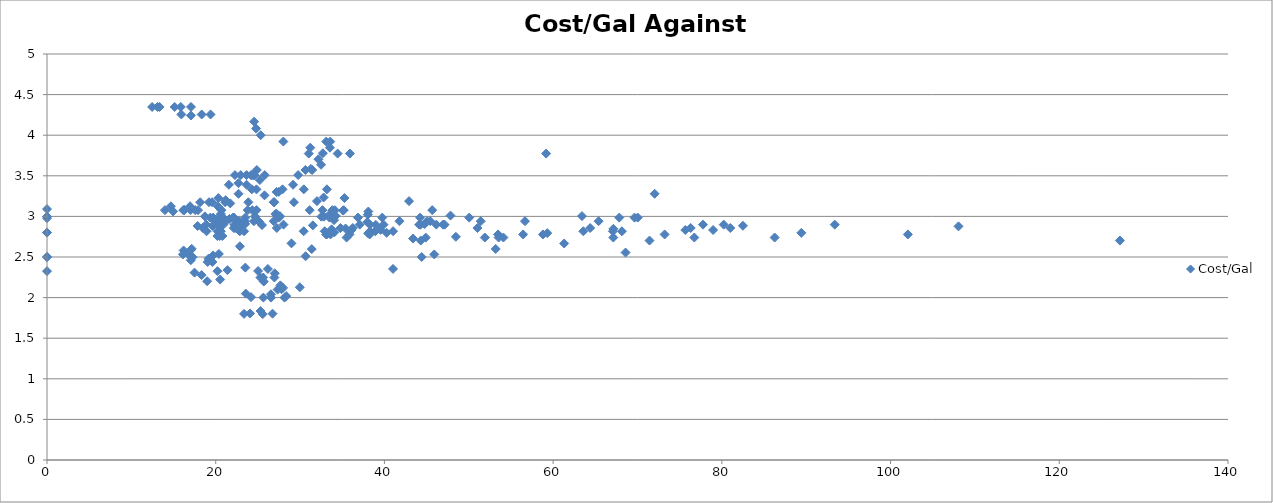
| Category | Cost/Gal |
|---|---|
| 0.0 | 2.5 |
| 0.0 | 2.5 |
| 0.0 | 2.326 |
| 0.0 | 2.801 |
| 0.0 | 2.801 |
| 0.0 | 3.09 |
| 0.0 | 2.978 |
| 0.0 | 2.999 |
| 0.0 | 2.999 |
| 23.458823529411763 | 2.94 |
| 22.870967741935484 | 2.928 |
| 19.62857142857143 | 2.882 |
| 17.854545454545455 | 2.882 |
| 21.638297872340427 | 2.969 |
| 20.333333333333332 | 2.882 |
| 21.164835164835164 | 2.936 |
| 20.78494623655914 | 2.759 |
| 20.462365591397848 | 2.759 |
| 20.376237623762375 | 2.538 |
| 19.150537634408604 | 2.479 |
| 19.608695652173914 | 2.439 |
| 20.20689655172414 | 2.326 |
| 18.98913043478261 | 2.202 |
| 17.489795918367346 | 2.308 |
| 16.11340206185567 | 2.532 |
| 16.96629213483146 | 2.519 |
| 16.70967741935484 | 2.538 |
| 16.197802197802197 | 2.58 |
| 17.151515151515152 | 2.601 |
| 16.989247311827956 | 2.581 |
| 17.043010752688172 | 2.46 |
| 17.263736263736263 | 2.498 |
| 18.32894736842105 | 2.277 |
| 20.525641025641026 | 2.222 |
| 19.048192771084338 | 2.439 |
| 19.691358024691358 | 2.519 |
| 20.2 | 2.759 |
| 19.985915492957748 | 2.941 |
| 20.3 | 2.941 |
| 20.27536231884058 | 2.981 |
| 22.29230769230769 | 2.857 |
| 21.727272727272727 | 3.161 |
| 21.176470588235293 | 3.2 |
| 22.703125 | 3.279 |
| 23.65573770491803 | 3.39 |
| 24.580645161290324 | 3.509 |
| 25.224137931034484 | 3.448 |
| 27.925925925925927 | 3.333 |
| 29.163265306122447 | 3.39 |
| 30.44 | 3.333 |
| 33.18181818181818 | 3.333 |
| 32.79545454545455 | 3.233 |
| 35.26086956521739 | 3.226 |
| 34.12765957446808 | 3.077 |
| 35.075 | 3.072 |
| 32.84 | 2.996 |
| 34.224489795918366 | 3.006 |
| 32.52542372881356 | 2.996 |
| 31.516129032258064 | 2.89 |
| 38.27777777777778 | 2.899 |
| 38.035714285714285 | 3.021 |
| 39.53703703703704 | 2.834 |
| 40.25925925925926 | 2.798 |
| 44.767857142857146 | 2.905 |
| 51.9 | 2.74 |
| 44.892857142857146 | 2.738 |
| 53.46938775510204 | 2.778 |
| 59.3 | 2.794 |
| 59.170731707317074 | 3.774 |
| 63.416666666666664 | 3.004 |
| 72.03225806451613 | 3.279 |
| 89.42307692307692 | 2.797 |
| 82.5 | 2.885 |
| 93.38095238095238 | 2.899 |
| 108.05263157894737 | 2.878 |
| 127.1875 | 2.703 |
| 102.04761904761905 | 2.778 |
| 80.21739130434783 | 2.899 |
| 75.66666666666667 | 2.832 |
| 73.21428571428571 | 2.778 |
| 58.794117647058826 | 2.778 |
| 56.44117647058823 | 2.778 |
| 51.027027027027025 | 2.857 |
| 44.225 | 2.985 |
| 29.274509803921568 | 3.175 |
| 26.875 | 3.175 |
| 26.946428571428573 | 3.175 |
| 23.866666666666667 | 3.175 |
| 20.24590163934426 | 3.125 |
| 19.35593220338983 | 2.985 |
| 17.90909090909091 | 3.077 |
| 17.015384615384615 | 3.077 |
| 16.953846153846154 | 3.125 |
| 19.20689655172414 | 3.175 |
| 20.615384615384617 | 3.03 |
| 21.115384615384617 | 3.175 |
| 22.040816326530614 | 2.985 |
| 20.865384615384617 | 2.985 |
| 20.90566037735849 | 2.899 |
| 23.06382978723404 | 2.899 |
| 23.51063829787234 | 2.985 |
| 25.13953488372093 | 2.936 |
| 24.28301886792453 | 3.333 |
| 22.69811320754717 | 3.409 |
| 22.966666666666665 | 3.509 |
| 23.655172413793103 | 3.509 |
| 24.267857142857142 | 3.509 |
| 24.425925925925927 | 3.509 |
| 25.81132075471698 | 3.509 |
| 24.535714285714285 | 3.509 |
| 24.189655172413794 | 3.509 |
| 24.82608695652174 | 3.333 |
| 29.772727272727273 | 3.509 |
| 31.43243243243243 | 3.571 |
| 30.63888888888889 | 3.571 |
| 31.28125 | 3.585 |
| 35.911764705882355 | 3.774 |
| 31.026315789473685 | 3.774 |
| 34.45454545454545 | 3.774 |
| 25.333333333333332 | 4 |
| 24.5531914893617 | 4.167 |
| 19.38888888888889 | 4.255 |
| 18.339622641509433 | 4.255 |
| 17.06779661016949 | 4.348 |
| 15.859154929577464 | 4.348 |
| 13.338235294117647 | 4.348 |
| 13.109375 | 4.348 |
| 12.462686567164178 | 4.348 |
| 15.134615384615385 | 4.348 |
| 15.923076923076923 | 4.255 |
| 17.0625 | 4.243 |
| 24.78688524590164 | 4.082 |
| 28.016666666666666 | 3.922 |
| 33.1 | 3.922 |
| 31.21153846153846 | 3.846 |
| 33.54 | 3.846 |
| 33.57692307692308 | 3.922 |
| 32.7037037037037 | 3.778 |
| 32.17741935483871 | 3.704 |
| 32.483870967741936 | 3.636 |
| 24.87037037037037 | 3.571 |
| 22.28301886792453 | 3.509 |
| 21.557692307692307 | 3.389 |
| 24.333333333333332 | 3.077 |
| 22.21311475409836 | 2.899 |
| 22.71186440677966 | 2.941 |
| 22.866666666666667 | 2.632 |
| 21.392156862745097 | 2.338 |
| 25.02173913043478 | 2.328 |
| 24.18867924528302 | 2.006 |
| 25.649122807017545 | 2 |
| 25.317460317460316 | 1.835 |
| 23.360655737704917 | 1.8 |
| 24.066666666666666 | 1.805 |
| 25.56896551724138 | 1.797 |
| 26.737704918032787 | 1.802 |
| 26.560606060606062 | 2 |
| 23.571428571428573 | 2.049 |
| 28.36842105263158 | 2.019 |
| 28.155172413793103 | 2 |
| 27.333333333333332 | 2.099 |
| 26.546875 | 2.041 |
| 27.80597014925373 | 2.105 |
| 27.666666666666668 | 2.151 |
| 29.967741935483872 | 2.128 |
| 27.785714285714285 | 2.105 |
| 27.985507246376812 | 2.119 |
| 25.696202531645568 | 2.198 |
| 25.293333333333333 | 2.247 |
| 25.63013698630137 | 2.247 |
| 26.955882352941178 | 2.247 |
| 27.0 | 2.299 |
| 26.184615384615384 | 2.353 |
| 23.514285714285716 | 2.369 |
| 30.653846153846153 | 2.51 |
| 41.02 | 2.353 |
| 44.41860465116279 | 2.5 |
| 45.904761904761905 | 2.532 |
| 53.189189189189186 | 2.599 |
| 68.58064516129032 | 2.555 |
| 71.42424242424242 | 2.703 |
| 76.73333333333333 | 2.74 |
| 86.25925925925925 | 2.74 |
| 78.96296296296296 | 2.832 |
| 67.14285714285714 | 2.847 |
| 76.3076923076923 | 2.857 |
| 81.0 | 2.857 |
| 77.76 | 2.899 |
| 68.15384615384616 | 2.817 |
| 64.3913043478261 | 2.857 |
| 67.08695652173913 | 2.817 |
| 67.1304347826087 | 2.74 |
| 63.57692307692308 | 2.817 |
| 61.30769230769231 | 2.667 |
| 53.535714285714285 | 2.74 |
| 54.107142857142854 | 2.74 |
| 48.46666666666667 | 2.749 |
| 38.30952380952381 | 2.817 |
| 41.02439024390244 | 2.818 |
| 43.390243902439025 | 2.727 |
| 46.945945945945944 | 2.899 |
| 38.06818181818182 | 2.792 |
| 36.244897959183675 | 2.857 |
| 34.795918367346935 | 2.857 |
| 35.391304347826086 | 2.851 |
| 38.976190476190474 | 2.895 |
| 51.41935483870968 | 2.941 |
| 45.42857142857143 | 2.941 |
| 37.973684210526315 | 2.931 |
| 37.06818181818182 | 2.899 |
| 47.13513513513514 | 2.899 |
| 45.05882352941177 | 2.941 |
| 44.121212121212125 | 2.899 |
| 46.15151515151515 | 2.899 |
| 44.27777777777778 | 2.899 |
| 38.916666666666664 | 2.817 |
| 35.51282051282051 | 2.74 |
| 38.25 | 2.778 |
| 33.17142857142857 | 2.778 |
| 30.428571428571427 | 2.817 |
| 33.083333333333336 | 2.778 |
| 33.73684210526316 | 2.841 |
| 36.07692307692308 | 2.832 |
| 33.61363636363637 | 2.778 |
| 31.382978723404257 | 2.597 |
| 35.86046511627907 | 2.778 |
| 35.951219512195124 | 2.817 |
| 34.06818181818182 | 2.804 |
| 32.92156862745098 | 2.817 |
| 28.035714285714285 | 2.899 |
| 27.24137931034483 | 2.857 |
| 23.03448275862069 | 2.904 |
| 23.362068965517242 | 2.817 |
| 22.852459016393443 | 2.817 |
| 20.21875 | 2.817 |
| 18.914285714285715 | 2.817 |
| 18.476923076923075 | 2.857 |
| 20.6 | 2.817 |
| 22.142857142857142 | 2.857 |
| 23.49019607843137 | 2.908 |
| 25.490909090909092 | 2.893 |
| 24.527272727272727 | 2.941 |
| 26.88 | 2.941 |
| 28.97826086956522 | 2.668 |
| 34.023809523809526 | 2.954 |
| 41.78048780487805 | 2.941 |
| 39.9 | 2.899 |
| 44.30555555555556 | 2.703 |
| 38.08888888888889 | 3.06 |
| 36.86666666666667 | 2.985 |
| 33.56521739130435 | 3.03 |
| 31.14 | 3.077 |
| 32.6530612244898 | 3.077 |
| 27.51851851851852 | 2.985 |
| 22.16949152542373 | 2.985 |
| 19.857142857142858 | 2.941 |
| 18.865671641791046 | 2.899 |
| 18.716666666666665 | 3 |
| 24.666666666666668 | 3 |
| 32.0 | 3.188 |
| 42.91891891891892 | 3.188 |
| 47.833333333333336 | 3.01 |
| 56.65714285714286 | 2.941 |
| 65.38709677419355 | 2.941 |
| 69.65517241379311 | 2.985 |
| 70.03448275862068 | 2.985 |
| 67.83870967741936 | 2.985 |
| 50.054054054054056 | 2.985 |
| 45.666666666666664 | 3.077 |
| 33.829787234042556 | 3.077 |
| 27.22 | 3.301 |
| 27.47826086956522 | 3.302 |
| 24.836363636363636 | 3.077 |
| 25.78846153846154 | 3.259 |
| 27.232142857142858 | 3.03 |
| 27.089285714285715 | 3.03 |
| 27.607843137254903 | 3.003 |
| 33.48979591836735 | 2.985 |
| 39.73809523809524 | 2.985 |
| 35.18 | 3.077 |
| 23.794117647058822 | 3.077 |
| 20.676056338028168 | 3.077 |
| 19.69333333333333 | 2.985 |
| 16.15 | 3.077 |
| 16.27848101265823 | 3.077 |
| 16.2875 | 3.079 |
| 14.949367088607595 | 3.061 |
| 13.977011494252874 | 3.077 |
| 14.6875 | 3.125 |
| 17.575757575757574 | 3.077 |
| 19.576271186440678 | 3.175 |
| 18.158730158730158 | 3.175 |
| 20.30909090909091 | 3.226 |